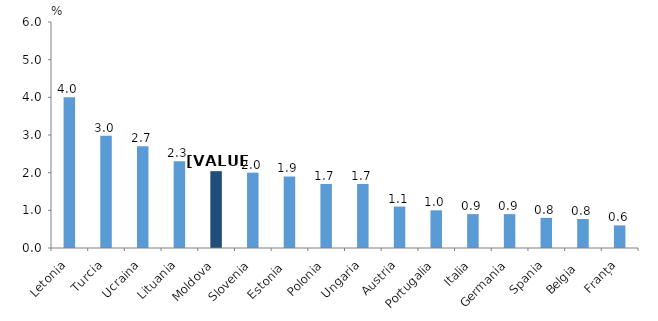
| Category | Rata lunară a inflației, mai 2022 comparativ cu aprilie 2022 |
|---|---|
| Letonia | 4 |
| Turcia | 2.98 |
| Ucraina | 2.7 |
| Lituania | 2.3 |
| Moldova | 2.04 |
| Slovenia | 2 |
| Estonia  | 1.9 |
| Polonia | 1.7 |
| Ungaria | 1.7 |
| Austria | 1.1 |
| Portugalia | 1 |
| Italia | 0.9 |
| Germania | 0.9 |
| Spania | 0.8 |
| Belgia  | 0.77 |
| Franța | 0.6 |